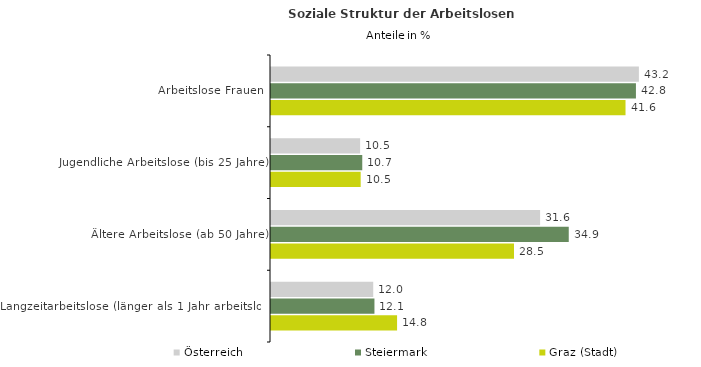
| Category | Österreich | Steiermark | Graz (Stadt) |
|---|---|---|---|
| Arbeitslose Frauen | 43.18 | 42.833 | 41.61 |
| Jugendliche Arbeitslose (bis 25 Jahre) | 10.46 | 10.711 | 10.525 |
| Ältere Arbeitslose (ab 50 Jahre) | 31.584 | 34.947 | 28.52 |
| Langzeitarbeitslose (länger als 1 Jahr arbeitslos) | 11.999 | 12.142 | 14.797 |